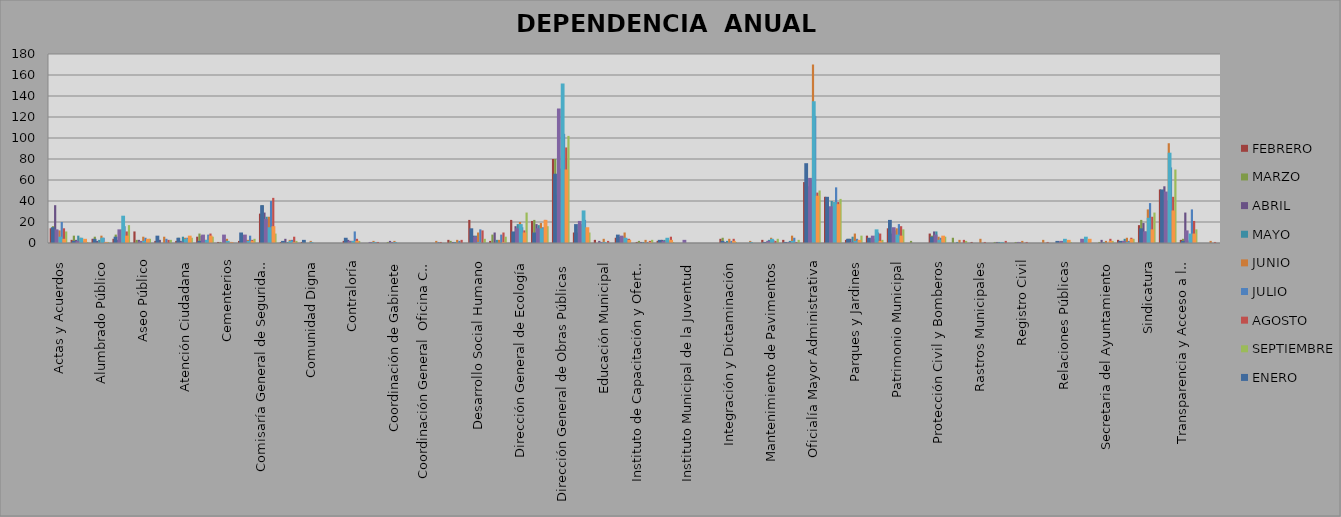
| Category | FEBRERO | MARZO | ABRIL | MAYO | JUNIO | JULIO | AGOSTO | SEPTIEMBRE |
|---|---|---|---|---|---|---|---|---|
| Actas y Acuerdos | 14 | 16 | 36 | 12 | 12 | 20 | 14 | 11 |
| Agua y Alcantarillado | 3 | 7 | 3 | 7 | 5 | 2 | 2 | 1 |
| Alumbrado Público | 4 | 6 | 2 | 3 | 7 | 5 | 1 | 1 |
| Archivo Municipal | 4 | 8 | 3 | 7 | 13 | 16 | 11 | 17 |
| Aseo Público | 11 | 3 | 3 | 1 | 6 | 5 | 2 | 4 |
| Asuntos Internos | 2 | 4 | 3 | 0 | 6 | 4 | 3 | 3 |
| Atención Ciudadana | 2 | 5 | 2 | 6 | 5 | 5 | 5 | 5 |
| Catastro | 6 | 9 | 7 | 3 | 3 | 8 | 9 | 6 |
| Cementerios | 1 | 1 | 0 | 3 | 4 | 0 | 1 | 0 |
| Centro de  Promoción Económica y Turismo | 2 | 1 | 6 | 3 | 3 | 7 | 3 | 4 |
| Comisaría General de Seguridad Pública | 28 | 36 | 29 | 25 | 25 | 40 | 43 | 9 |
| Comunicación Social | 1 | 1 | 4 | 1 | 3 | 3 | 6 | 2 |
| Comunidad Digna | 1 | 2 | 0 | 0 | 2 | 0 | 0 | 0 |
| Consejería Juridica | 0 | 0 | 0 | 0 | 0 | 0 | 0 | 0 |
| Contraloría | 2 | 2 | 3 | 2 | 2 | 11 | 4 | 2 |
| Coordinación de Delegaciones | 0 | 0 | 0 | 0 | 2 | 1 | 1 | 0 |
| Coordinación de Gabinete | 0 | 1 | 2 | 0 | 2 | 0 | 0 | 0 |
| Coordinación de la Oficina de Presidencia  | 0 | 0 | 0 | 0 | 0 | 0 | 0 | 0 |
| Coordinación General  Oficina Central de Gobierno, Estrategía y opinión Pública | 0 | 0 | 0 | 0 | 2 | 1 | 1 | 0 |
| Coplademun | 3 | 2 | 1 | 1 | 3 | 2 | 3 | 0 |
| Desarrollo Social Humano | 22 | 9 | 7 | 7 | 10 | 13 | 12 | 4 |
| Dirección General de  Innovación y Tecnología | 2 | 8 | 10 | 3 | 3 | 8 | 10 | 6 |
| Dirección General de Ecología | 22 | 9 | 16 | 18 | 20 | 15 | 12 | 29 |
| Dirección General de Inspección de Reglamentos | 21 | 22 | 18 | 17 | 19 | 15 | 22 | 16 |
| Dirección General de Obras Públicas | 80 | 80 | 46 | 71 | 83 | 104 | 91 | 102 |
| Dirección General de Servicios Públicos | 10 | 13 | 10 | 18 | 16 | 22 | 7 | 10 |
| Educación Municipal | 3 | 0 | 2 | 0 | 4 | 0 | 2 | 0 |
| Estacionómetros y Estacionamientos | 5 | 1 | 6 | 6 | 10 | 4 | 4 | 0 |
| Instituto de Capacitación y Oferta Educativa | 1 | 2 | 1 | 1 | 3 | 1 | 2 | 3 |
| Instituto de Cultura | 2 | 0 | 3 | 3 | 3 | 2 | 6 | 1 |
| Instituto Municipal de la Juventud | 0 | 0 | 0 | 0 | 0 | 0 | 0 | 0 |
| Instituto Municipal de la Mujer | 0 | 0 | 0 | 0 | 0 | 0 | 0 | 0 |
| Integración y Dictaminación | 4 | 5 | 1 | 2 | 4 | 2 | 4 | 1 |
| Junta Municipal de Reclutamiento | 0 | 0 | 0 | 0 | 2 | 0 | 0 | 0 |
| Mantenimiento de Pavimentos | 3 | 0 | 1 | 3 | 5 | 3 | 2 | 4 |
| Mantenimiento Urbano | 3 | 0 | 0 | 2 | 7 | 5 | 1 | 3 |
| Oficialía Mayor Administrativa | 58 | 60 | 54 | 60 | 170 | 121 | 48 | 50 |
| Oficialía Mayor de Padrón y Licencias | 44 | 37 | 30 | 40 | 39 | 53 | 39 | 42 |
| Parques y Jardines | 3 | 4 | 4 | 6 | 9 | 4 | 1 | 7 |
| Participación Ciudadana | 7 | 4 | 1 | 4 | 7 | 10 | 9 | 3 |
| Patrimonio Municipal | 14 | 11 | 9 | 12 | 14 | 18 | 16 | 13 |
| Protección al Medio Ambiente | 0 | 2 | 0 | 0 | 0 | 0 | 0 | 0 |
| Protección Civil y Bomberos | 9 | 7 | 11 | 11 | 6 | 5 | 5 | 6 |
| Proyectos Estratégicos | 0 | 5 | 0 | 1 | 3 | 0 | 3 | 2 |
| Rastros Municipales | 1 | 0 | 0 | 0 | 4 | 0 | 1 | 0 |
| Regidores | 0 | 1 | 1 | 1 | 0 | 0 | 2 | 0 |
| Registro Civil | 0 | 1 | 1 | 0 | 2 | 0 | 1 | 0 |
| Relaciones Exteriores | 0 | 0 | 0 | 0 | 3 | 0 | 1 | 0 |
| Relaciones Públicas | 0 | 0 | 1 | 0 | 3 | 1 | 2 | 1 |
| Sanidad Animal | 0 | 0 | 0 | 0 | 1 | 0 | 0 | 0 |
| Secretaria del Ayuntamiento | 0 | 1 | 3 | 1 | 2 | 0 | 4 | 2 |
| Secretaría Particular | 3 | 1 | 2 | 4 | 5 | 2 | 5 | 4 |
| Sindicatura | 17 | 22 | 19 | 11 | 32 | 38 | 25 | 29 |
| Tesorería | 51 | 40 | 54 | 40 | 95 | 72 | 44 | 70 |
| Transparencia y Acceso a la Información | 3 | 4 | 29 | 2 | 3 | 32 | 21 | 13 |
| Vinculación Asuntos Religiosos | 0 | 0 | 0 | 0 | 2 | 0 | 1 | 0 |